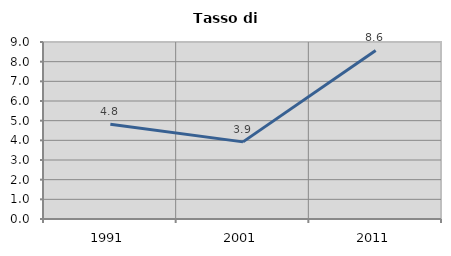
| Category | Tasso di disoccupazione   |
|---|---|
| 1991.0 | 4.819 |
| 2001.0 | 3.922 |
| 2011.0 | 8.571 |